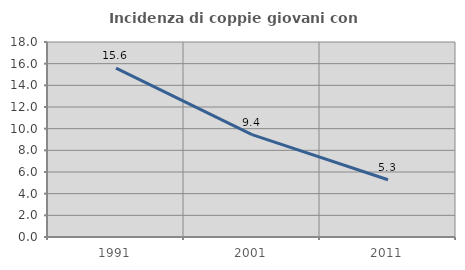
| Category | Incidenza di coppie giovani con figli |
|---|---|
| 1991.0 | 15.588 |
| 2001.0 | 9.446 |
| 2011.0 | 5.283 |